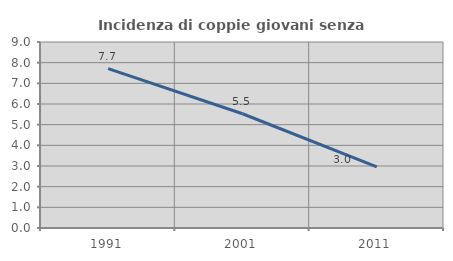
| Category | Incidenza di coppie giovani senza figli |
|---|---|
| 1991.0 | 7.713 |
| 2001.0 | 5.529 |
| 2011.0 | 2.955 |